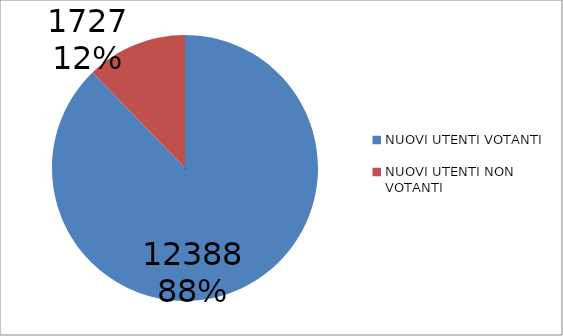
| Category | Series 0 |
|---|---|
| NUOVI UTENTI VOTANTI | 12388 |
| NUOVI UTENTI NON VOTANTI | 1727 |